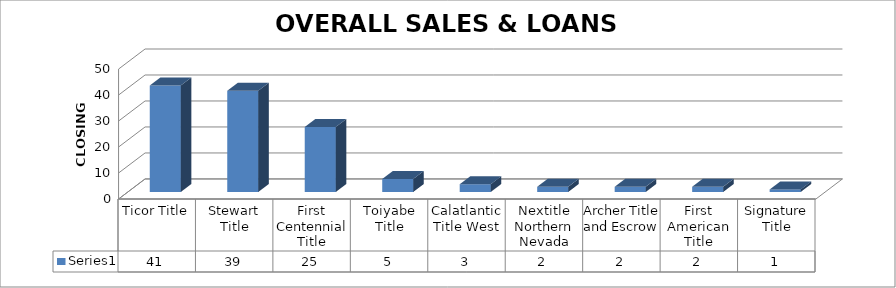
| Category | Series 0 |
|---|---|
| Ticor Title | 41 |
| Stewart Title | 39 |
| First Centennial Title | 25 |
| Toiyabe Title | 5 |
| Calatlantic Title West | 3 |
| Nextitle Northern Nevada | 2 |
| Archer Title and Escrow | 2 |
| First American Title | 2 |
| Signature Title | 1 |